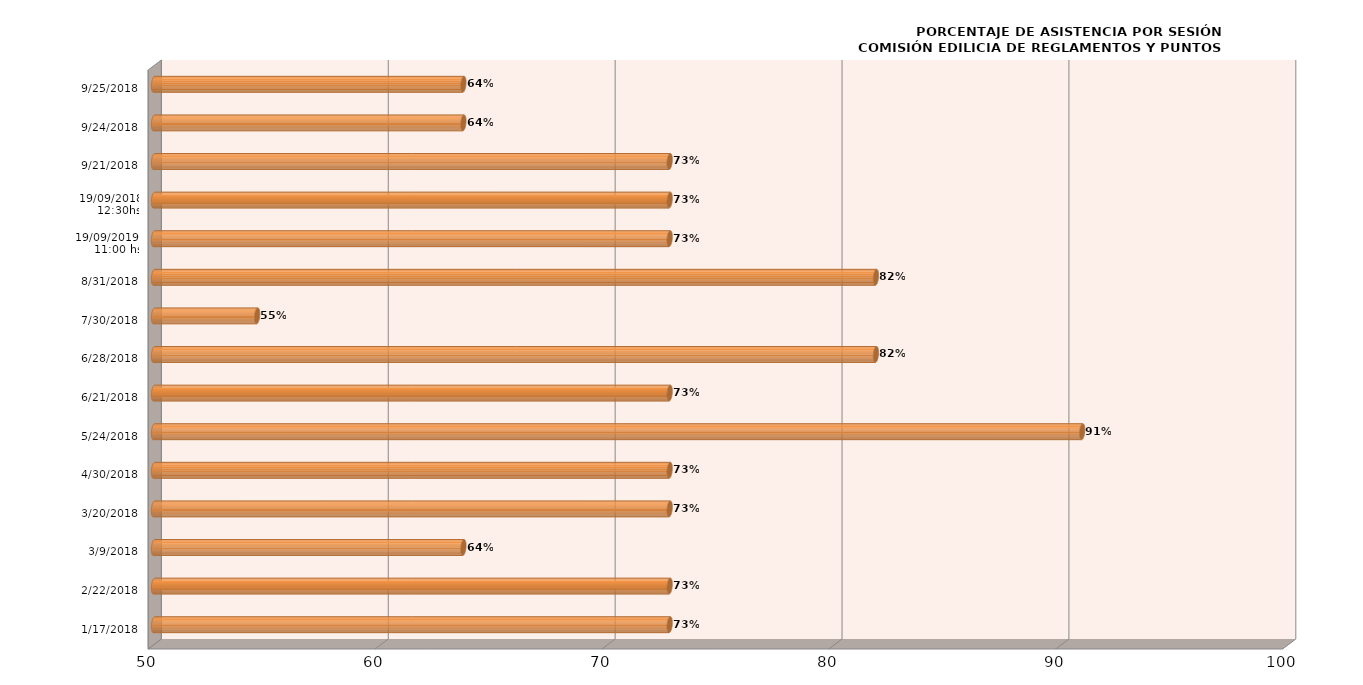
| Category | Series 0 |
|---|---|
| 17/01/2018 | 72.727 |
| 22/02/2018 | 72.727 |
| 09/03/2018 | 63.636 |
| 20/03/2018 | 72.727 |
| 30/04/2018 | 72.727 |
| 24/05/2018 | 90.909 |
| 21/06/2018 | 72.727 |
| 28/06/2018 | 81.818 |
| 30/07/2018 | 54.545 |
| 31/08/2018 | 81.818 |
| 19/09/2019 
11:00 hs | 72.727 |
| 19/09/2018
12:30hs | 72.727 |
| 21/09/2018 | 72.727 |
| 24/09/2018 | 63.636 |
| 25/09/2018 | 63.636 |